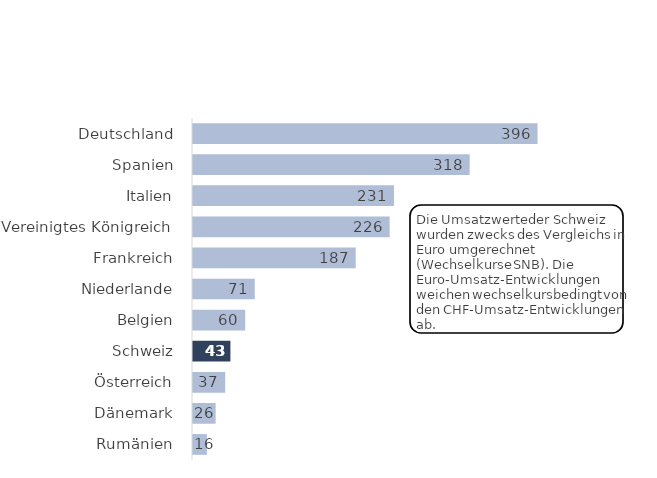
| Category | 2020 |
|---|---|
| Rumänien | 16 |
| Dänemark | 26 |
| Österreich | 37 |
| Schweiz | 43 |
| Belgien | 60 |
| Niederlande | 71 |
| Frankreich | 187 |
| Vereinigtes Königreich | 226 |
| Italien | 231 |
| Spanien | 318 |
| Deutschland | 396 |